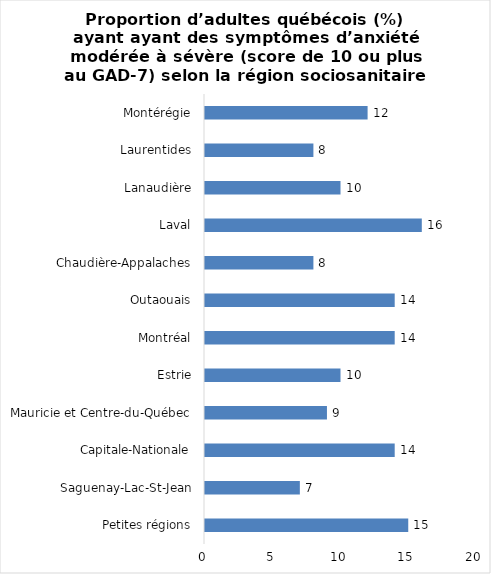
| Category | Series 0 |
|---|---|
| Petites régions | 15 |
| Saguenay-Lac-St-Jean | 7 |
| Capitale-Nationale | 14 |
| Mauricie et Centre-du-Québec | 9 |
| Estrie | 10 |
| Montréal | 14 |
| Outaouais | 14 |
| Chaudière-Appalaches | 8 |
| Laval | 16 |
| Lanaudière | 10 |
| Laurentides | 8 |
| Montérégie | 12 |